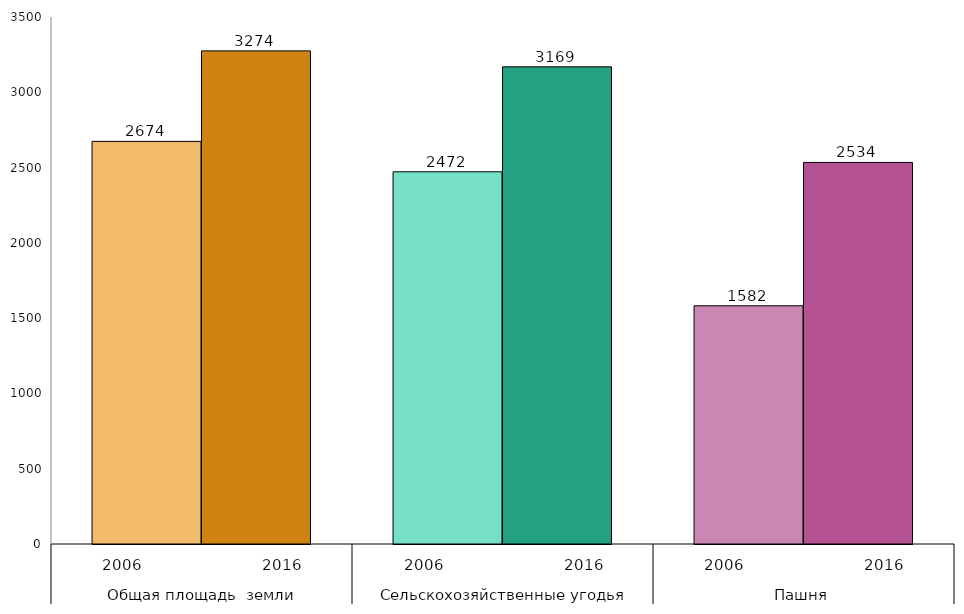
| Category | Series 0 | Series 1 |
|---|---|---|
| 0 | 2674 | 3275 |
| 1 | 2472 | 3169 |
| 2 | 1582 | 2534 |